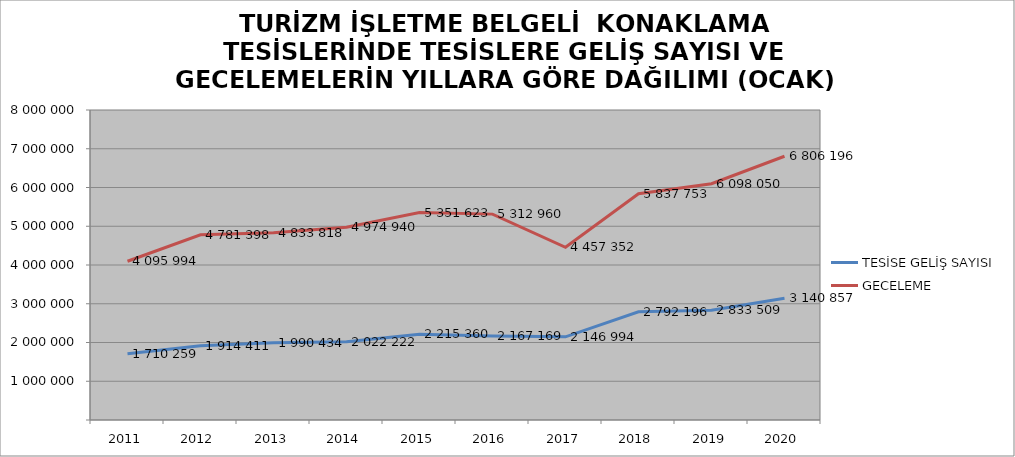
| Category | TESİSE GELİŞ SAYISI | GECELEME |
|---|---|---|
| 2011 | 1710259 | 4095994 |
| 2012 | 1914411 | 4781398 |
| 2013 | 1990434 | 4833818 |
| 2014 | 2022222 | 4974940 |
| 2015 | 2215360 | 5351623 |
| 2016 | 2167169 | 5312960 |
| 2017 | 2146994 | 4457352 |
| 2018 | 2792196 | 5837753 |
| 2019 | 2833509 | 6098050 |
| 2020 | 3140857 | 6806196 |